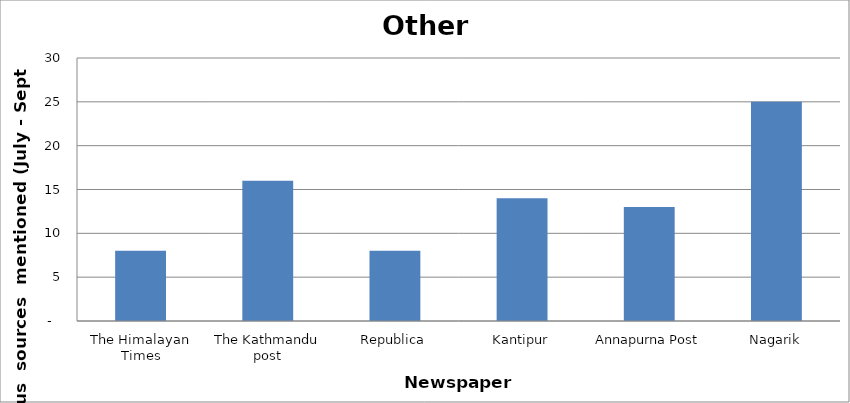
| Category | Others |
|---|---|
| The Himalayan Times | 8 |
| The Kathmandu post | 16 |
| Republica | 8 |
| Kantipur | 14 |
| Annapurna Post | 13 |
| Nagarik | 25 |